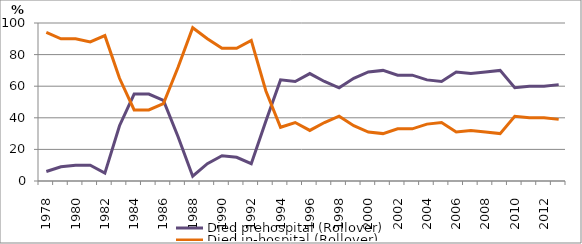
| Category | Died prehospital (Rollover) | Died in-hospital (Rollover) |
|---|---|---|
| 1978.0 | 6 | 94 |
| 1979.0 | 9 | 90 |
| 1980.0 | 10 | 90 |
| 1981.0 | 10 | 88 |
| 1982.0 | 5 | 92 |
| 1983.0 | 35 | 65 |
| 1984.0 | 55 | 45 |
| 1985.0 | 55 | 45 |
| 1986.0 | 51 | 49 |
| 1987.0 | 28 | 72 |
| 1988.0 | 3 | 97 |
| 1989.0 | 11 | 90 |
| 1990.0 | 16 | 84 |
| 1991.0 | 15 | 84 |
| 1992.0 | 11 | 89 |
| 1993.0 | 38 | 57 |
| 1994.0 | 64 | 34 |
| 1995.0 | 63 | 37 |
| 1996.0 | 68 | 32 |
| 1997.0 | 63 | 37 |
| 1998.0 | 59 | 41 |
| 1999.0 | 65 | 35 |
| 2000.0 | 69 | 31 |
| 2001.0 | 70 | 30 |
| 2002.0 | 67 | 33 |
| 2003.0 | 67 | 33 |
| 2004.0 | 64 | 36 |
| 2005.0 | 63 | 37 |
| 2006.0 | 69 | 31 |
| 2007.0 | 68 | 32 |
| 2008.0 | 69 | 31 |
| 2009.0 | 70 | 30 |
| 2010.0 | 59 | 41 |
| 2011.0 | 60 | 40 |
| 2012.0 | 60 | 40 |
| 2013.0 | 61 | 39 |